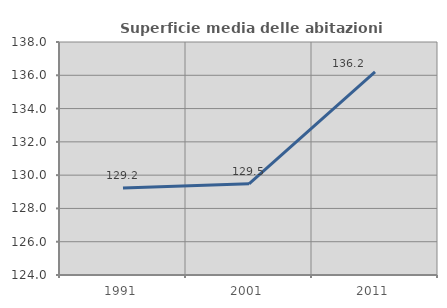
| Category | Superficie media delle abitazioni occupate |
|---|---|
| 1991.0 | 129.222 |
| 2001.0 | 129.481 |
| 2011.0 | 136.199 |